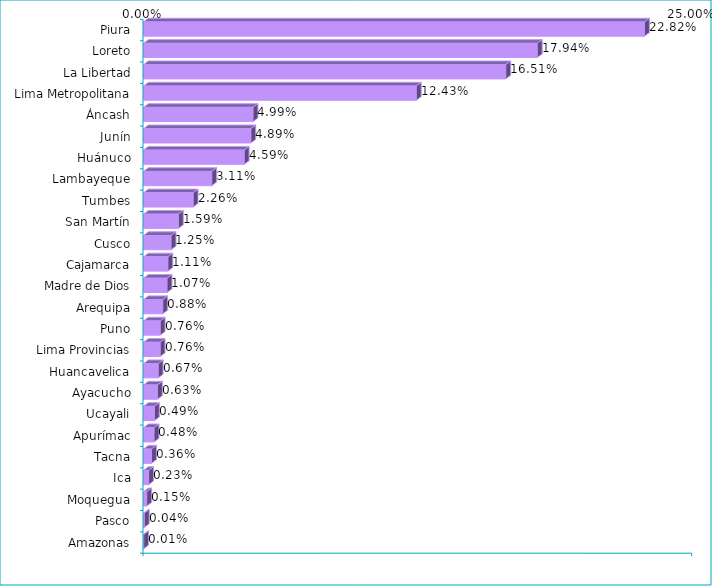
| Category | Series 0 |
|---|---|
| Piura | 0.228 |
| Loreto | 0.179 |
| La Libertad | 0.165 |
| Lima Metropolitana | 0.124 |
| Áncash | 0.05 |
| Junín | 0.049 |
| Huánuco | 0.046 |
| Lambayeque | 0.031 |
| Tumbes | 0.023 |
| San Martín | 0.016 |
| Cusco | 0.013 |
| Cajamarca | 0.011 |
| Madre de Dios | 0.011 |
| Arequipa | 0.009 |
| Puno | 0.008 |
| Lima Provincias | 0.008 |
| Huancavelica | 0.007 |
| Ayacucho | 0.006 |
| Ucayali | 0.005 |
| Apurímac | 0.005 |
| Tacna | 0.004 |
| Ica | 0.002 |
| Moquegua | 0.001 |
| Pasco | 0 |
| Amazonas | 0 |